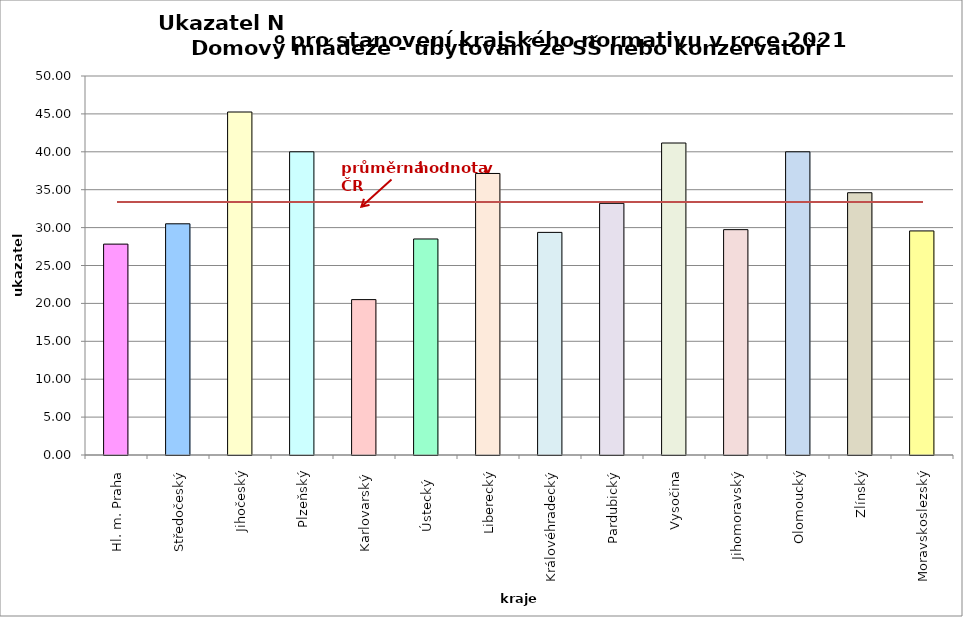
| Category | Series 0 |
|---|---|
| Hl. m. Praha | 27.82 |
| Středočeský | 30.5 |
| Jihočeský | 45.25 |
| Plzeňský | 40 |
| Karlovarský  | 20.5 |
| Ústecký   | 28.5 |
| Liberecký | 37.142 |
| Královéhradecký | 29.37 |
| Pardubický | 33.2 |
| Vysočina | 41.16 |
| Jihomoravský | 29.73 |
| Olomoucký | 40 |
| Zlínský | 34.6 |
| Moravskoslezský | 29.56 |